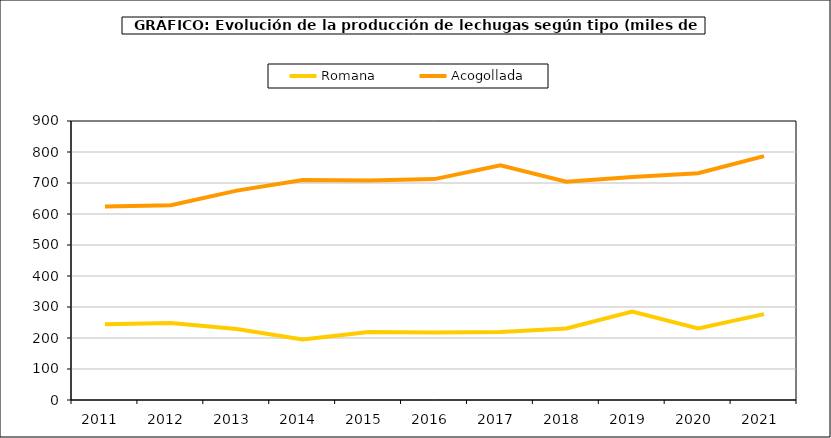
| Category | Romana | Acogollada |
|---|---|---|
| 2011.0 | 244.577 | 623.859 |
| 2012.0 | 248.374 | 628.552 |
| 2013.0 | 228.928 | 675.355 |
| 2014.0 | 195.068 | 709.734 |
| 2015.0 | 219.245 | 708.133 |
| 2016.0 | 217.427 | 712.517 |
| 2017.0 | 219.317 | 756.795 |
| 2018.0 | 230.508 | 704.162 |
| 2019.0 | 285.298 | 719.379 |
| 2020.0 | 230.586 | 731.352 |
| 2021.0 | 277.033 | 786.742 |